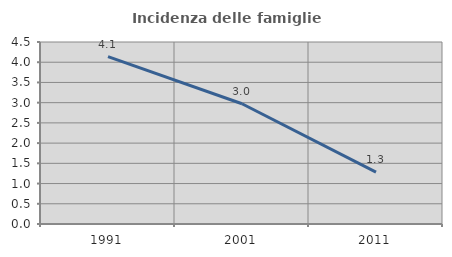
| Category | Incidenza delle famiglie numerose |
|---|---|
| 1991.0 | 4.137 |
| 2001.0 | 2.974 |
| 2011.0 | 1.282 |